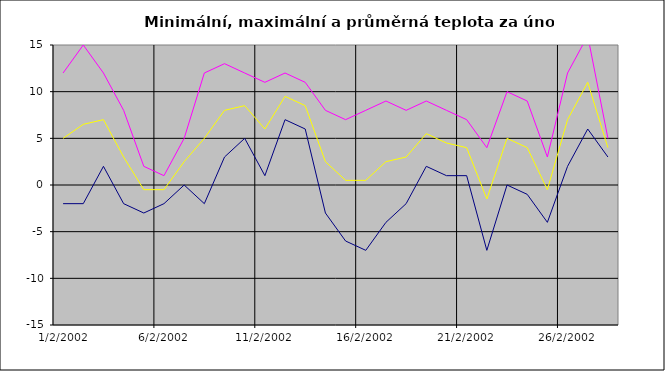
| Category | Series 0 | Series 1 | Series 2 |
|---|---|---|---|
| 2002-02-01 | -2 | 12 | 5 |
| 2002-02-02 | -2 | 15 | 6.5 |
| 2002-02-03 | 2 | 12 | 7 |
| 2002-02-04 | -2 | 8 | 3 |
| 2002-02-05 | -3 | 2 | -0.5 |
| 2002-02-06 | -2 | 1 | -0.5 |
| 2002-02-07 | 0 | 5 | 2.5 |
| 2002-02-08 | -2 | 12 | 5 |
| 2002-02-09 | 3 | 13 | 8 |
| 2002-02-10 | 5 | 12 | 8.5 |
| 2002-02-11 | 1 | 11 | 6 |
| 2002-02-12 | 7 | 12 | 9.5 |
| 2002-02-13 | 6 | 11 | 8.5 |
| 2002-02-14 | -3 | 8 | 2.5 |
| 2002-02-15 | -6 | 7 | 0.5 |
| 2002-02-16 | -7 | 8 | 0.5 |
| 2002-02-17 | -4 | 9 | 2.5 |
| 2002-02-18 | -2 | 8 | 3 |
| 2002-02-19 | 2 | 9 | 5.5 |
| 2002-02-20 | 1 | 8 | 4.5 |
| 2002-02-21 | 1 | 7 | 4 |
| 2002-02-22 | -7 | 4 | -1.5 |
| 2002-02-23 | 0 | 10 | 5 |
| 2002-02-24 | -1 | 9 | 4 |
| 2002-02-25 | -4 | 3 | -0.5 |
| 2002-02-26 | 2 | 12 | 7 |
| 2002-02-27 | 6 | 16 | 11 |
| 2002-02-28 | 3 | 5 | 4 |